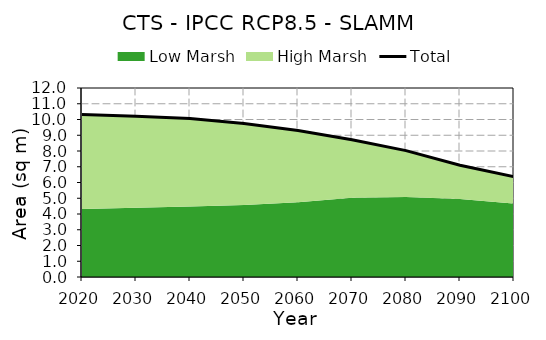
| Category | Total |
|---|---|
| 0 | 10.31 |
| 1 | 10.2 |
| 2 | 10.067 |
| 3 | 9.739 |
| 4 | 9.3 |
| 5 | 8.709 |
| 6 | 8.023 |
| 7 | 7.092 |
| 8 | 6.368 |